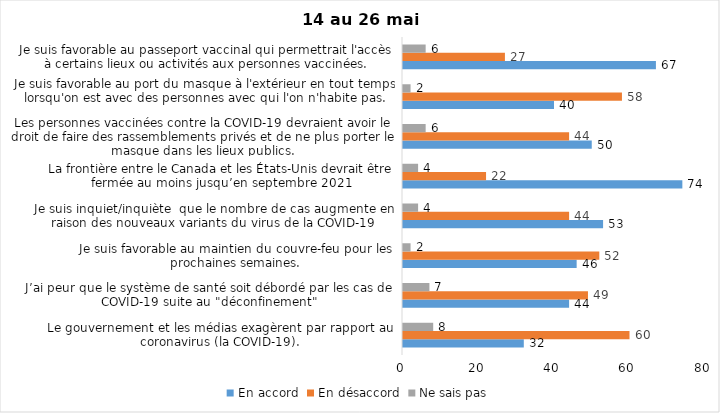
| Category | En accord | En désaccord | Ne sais pas |
|---|---|---|---|
| Le gouvernement et les médias exagèrent par rapport au coronavirus (la COVID-19). | 32 | 60 | 8 |
| J’ai peur que le système de santé soit débordé par les cas de COVID-19 suite au "déconfinement" | 44 | 49 | 7 |
| Je suis favorable au maintien du couvre-feu pour les prochaines semaines. | 46 | 52 | 2 |
| Je suis inquiet/inquiète  que le nombre de cas augmente en raison des nouveaux variants du virus de la COVID-19 | 53 | 44 | 4 |
| La frontière entre le Canada et les États-Unis devrait être fermée au moins jusqu’en septembre 2021 | 74 | 22 | 4 |
| Les personnes vaccinées contre la COVID-19 devraient avoir le droit de faire des rassemblements privés et de ne plus porter le masque dans les lieux publics. | 50 | 44 | 6 |
| Je suis favorable au port du masque à l'extérieur en tout temps lorsqu'on est avec des personnes avec qui l'on n'habite pas. | 40 | 58 | 2 |
| Je suis favorable au passeport vaccinal qui permettrait l'accès à certains lieux ou activités aux personnes vaccinées. | 67 | 27 | 6 |